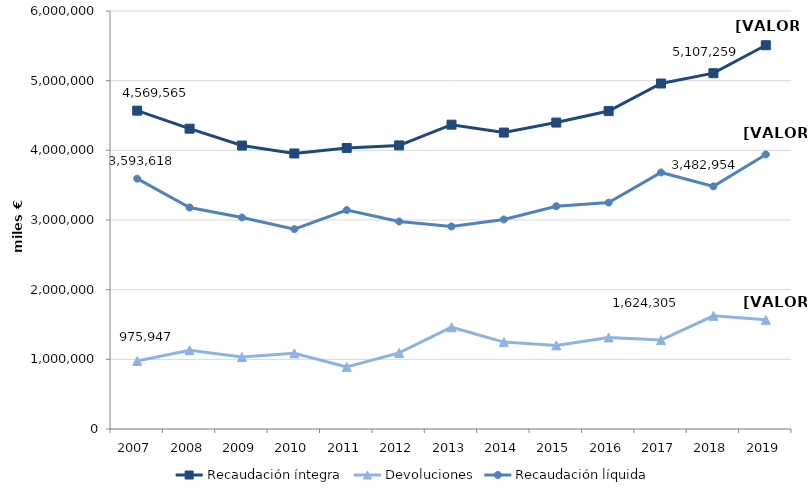
| Category | Recaudación íntegra | Devoluciones | Recaudación líquida |
|---|---|---|---|
| 2007.0 | 4569564.694 | 975947.184 | 3593617.511 |
| 2008.0 | 4310607.817 | 1131418.411 | 3179189.405 |
| 2009.0 | 4068712.882 | 1032557.036 | 3036155.845 |
| 2010.0 | 3954897.595 | 1085991.918 | 2868905.677 |
| 2011.0 | 4034191.014 | 891687.288 | 3142503.727 |
| 2012.0 | 4070844.381 | 1092254.555 | 2978589.826 |
| 2013.0 | 4368385.495 | 1461255.497 | 2907129.998 |
| 2014.0 | 4255033.664 | 1247467.968 | 3007565.696 |
| 2015.0 | 4398741.824 | 1200312.032 | 3198429.792 |
| 2016.0 | 4563540.838 | 1313808.981 | 3249731.857 |
| 2017.0 | 4959181.282 | 1276510.17 | 3682671.113 |
| 2018.0 | 5107259.058 | 1624305.468 | 3482953.59 |
| 2019.0 | 5508404.99 | 1567272.995 | 3941131.995 |